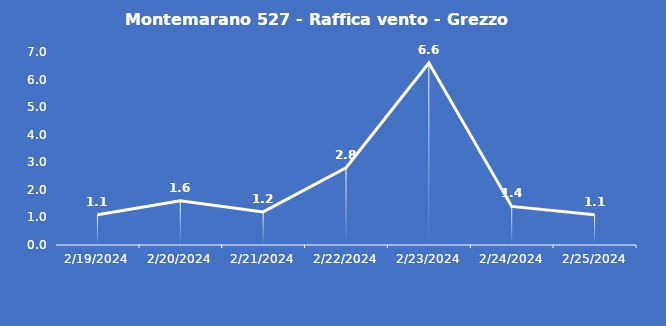
| Category | Montemarano 527 - Raffica vento - Grezzo (m/s) |
|---|---|
| 2/19/24 | 1.1 |
| 2/20/24 | 1.6 |
| 2/21/24 | 1.2 |
| 2/22/24 | 2.8 |
| 2/23/24 | 6.6 |
| 2/24/24 | 1.4 |
| 2/25/24 | 1.1 |